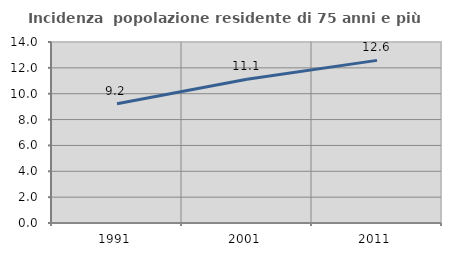
| Category | Incidenza  popolazione residente di 75 anni e più |
|---|---|
| 1991.0 | 9.23 |
| 2001.0 | 11.111 |
| 2011.0 | 12.579 |